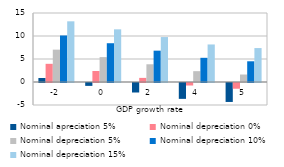
| Category | Nominal apreciation 5% | Nominal depreciation 0% | Nominal depreciation 5% | Nominal depreciation 10% | Nominal depreciation 15% |
|---|---|---|---|---|---|
| -2.0 | 0.872 | 3.952 | 7.032 | 10.112 | 13.192 |
| 0.0 | -0.626 | 2.392 | 5.411 | 8.429 | 11.448 |
| 2.0 | -2.065 | 0.894 | 3.853 | 6.813 | 9.772 |
| 4.0 | -3.449 | -0.547 | 2.356 | 5.258 | 8.16 |
| 5.0 | -4.121 | -1.246 | 1.628 | 4.503 | 7.378 |